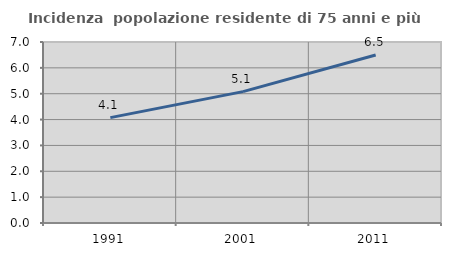
| Category | Incidenza  popolazione residente di 75 anni e più |
|---|---|
| 1991.0 | 4.076 |
| 2001.0 | 5.082 |
| 2011.0 | 6.499 |